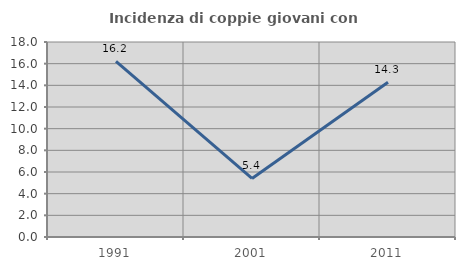
| Category | Incidenza di coppie giovani con figli |
|---|---|
| 1991.0 | 16.216 |
| 2001.0 | 5.405 |
| 2011.0 | 14.286 |